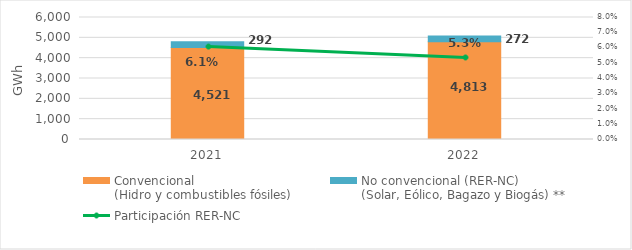
| Category | Convencional
(Hidro y combustibles fósiles) | No convencional (RER-NC)
(Solar, Eólico, Bagazo y Biogás) ** |
|---|---|---|
| 2021.0 | 4521.092 | 291.651 |
| 2022.0 | 4812.78 | 271.788 |